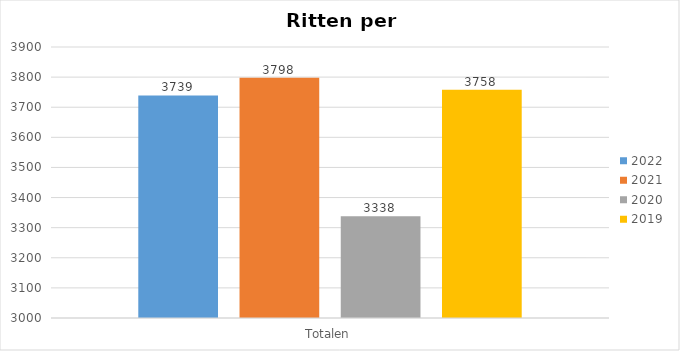
| Category | 2022 | 2021 | 2020 | 2019 |
|---|---|---|---|---|
| Totalen | 3739 | 3798 | 3338 | 3758 |